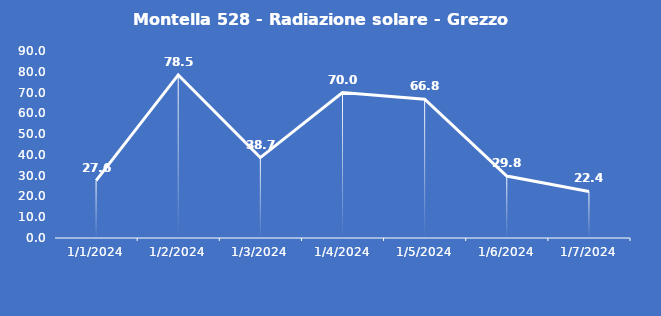
| Category | Montella 528 - Radiazione solare - Grezzo (W/m2) |
|---|---|
| 1/1/24 | 27.6 |
| 1/2/24 | 78.5 |
| 1/3/24 | 38.7 |
| 1/4/24 | 70 |
| 1/5/24 | 66.8 |
| 1/6/24 | 29.8 |
| 1/7/24 | 22.4 |